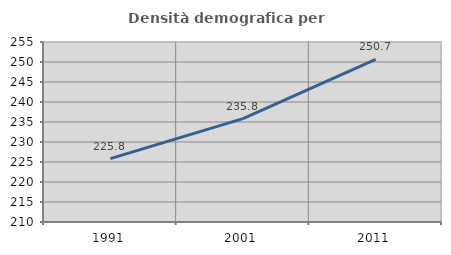
| Category | Densità demografica |
|---|---|
| 1991.0 | 225.841 |
| 2001.0 | 235.828 |
| 2011.0 | 250.678 |